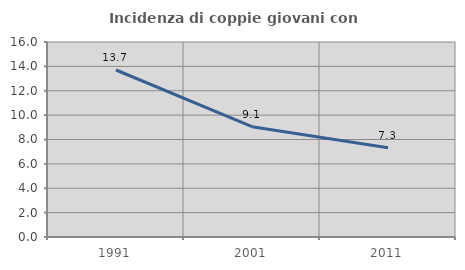
| Category | Incidenza di coppie giovani con figli |
|---|---|
| 1991.0 | 13.703 |
| 2001.0 | 9.051 |
| 2011.0 | 7.314 |